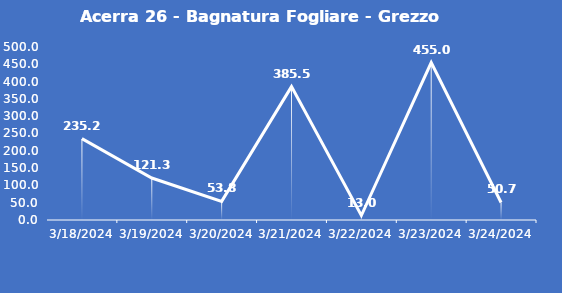
| Category | Acerra 26 - Bagnatura Fogliare - Grezzo (min) |
|---|---|
| 3/18/24 | 235.2 |
| 3/19/24 | 121.3 |
| 3/20/24 | 53.8 |
| 3/21/24 | 385.5 |
| 3/22/24 | 13 |
| 3/23/24 | 455 |
| 3/24/24 | 50.7 |